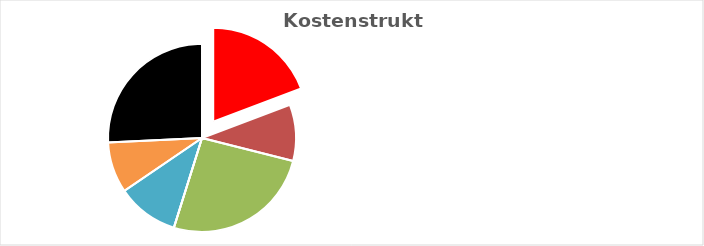
| Category | Series 0 |
|---|---|
| KV-Entgelt produktiv Tätige | 1 |
| Weitere Personalkosten produktiv | 0.503 |
| Personalnebenkosten | 1.345 |
| Unproduktives Personal | 0 |
| Deckung Personalgemeinkosten | 0.553 |
| Umlagen ohne GZ | 0.455 |
| Gesamtzuschlag | 1.338 |